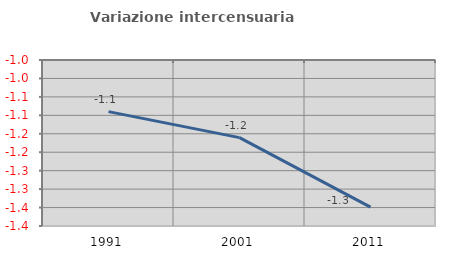
| Category | Variazione intercensuaria annua |
|---|---|
| 1991.0 | -1.09 |
| 2001.0 | -1.16 |
| 2011.0 | -1.349 |